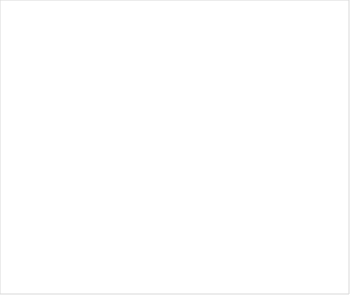
| Category | Series 0 |
|---|---|
| Living | 0 |
| Transportation | 0 |
| Eating | 0 |
| Fun | 0 |
| Personal Care | 0 |
| Student Loans | 0 |
| Other | 0 |
| Savings | 0 |